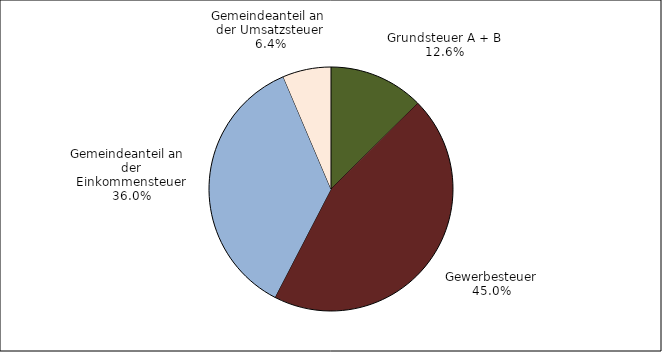
| Category | Series 0 |
|---|---|
| Grundsteuer A + B | 0.126 |
| Gewerbesteuer | 0.45 |
| Gemeindeanteil an  
der Einkommensteuer | 0.36 |
| Gemeindeanteil an 
der Umsatzsteuer | 0.064 |